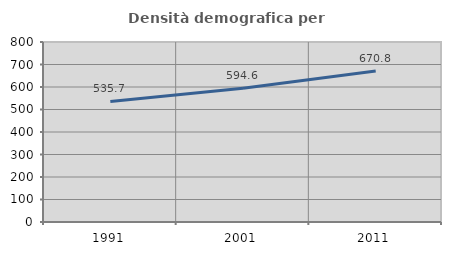
| Category | Densità demografica |
|---|---|
| 1991.0 | 535.712 |
| 2001.0 | 594.564 |
| 2011.0 | 670.834 |